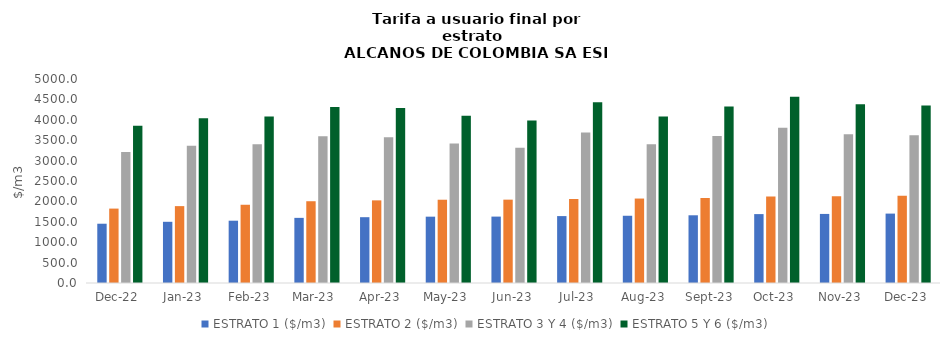
| Category | ESTRATO 1 ($/m3) | ESTRATO 2 ($/m3) | ESTRATO 3 Y 4 ($/m3) | ESTRATO 5 Y 6 ($/m3) |
|---|---|---|---|---|
| 2022-12-01 | 1452.83 | 1823.71 | 3209.93 | 3851.916 |
| 2023-01-01 | 1500.18 | 1884.37 | 3365.49 | 4038.588 |
| 2023-02-01 | 1526.99 | 1917.75 | 3398.26 | 4077.912 |
| 2023-03-01 | 1596.45 | 2004.11 | 3596.1 | 4315.32 |
| 2023-04-01 | 1613.02 | 2025.28 | 3575.22 | 4290.264 |
| 2023-05-01 | 1625.74 | 2040.95 | 3416.65 | 4099.98 |
| 2023-06-01 | 1627.48 | 2042.98 | 3316.57 | 3979.884 |
| 2023-07-01 | 1639.99 | 2059.51 | 3689.81 | 4427.772 |
| 2023-08-01 | 1648.05 | 2069.91 | 3401.48 | 4081.776 |
| 2023-09-01 | 1659.68 | 2084.34 | 3603.59 | 4324.308 |
| 2023-10-01 | 1688.77 | 2120.24 | 3805.44 | 4566.528 |
| 2023-11-01 | 1692.88 | 2125.65 | 3648.51 | 4378.212 |
| 2023-12-01 | 1701.04 | 2135.49 | 3624.28 | 4349.136 |